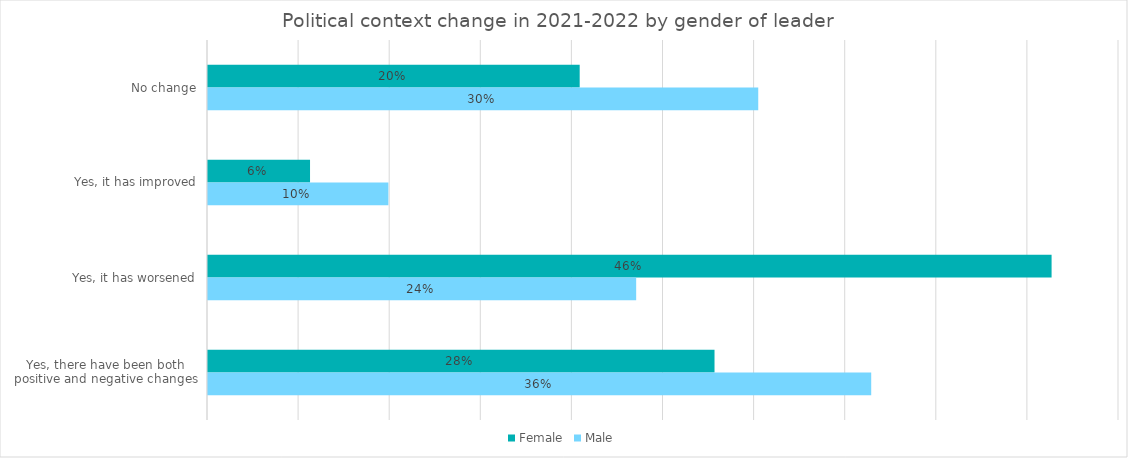
| Category | Female | Male |
|---|---|---|
| No change | 0.204 | 0.302 |
| Yes, it has improved | 0.056 | 0.099 |
| Yes, it has worsened | 0.463 | 0.235 |
| Yes, there have been both positive and negative changes | 0.278 | 0.364 |